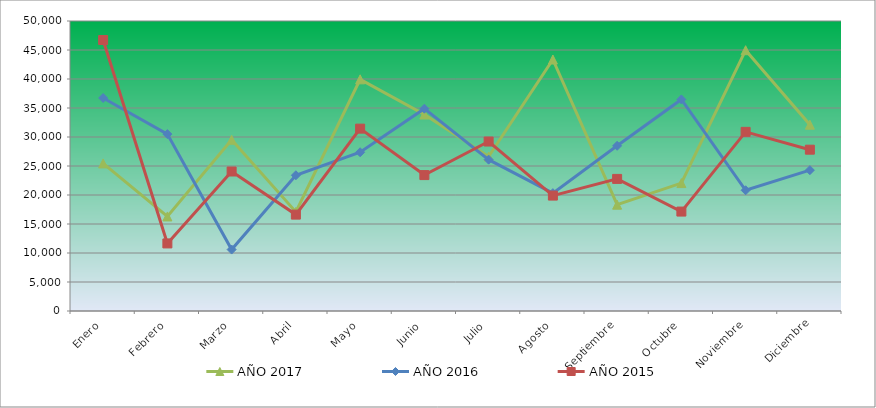
| Category | AÑO 2017 | AÑO 2016 | AÑO 2015 |
|---|---|---|---|
| Enero | 25445.371 | 36726.762 | 46722.034 |
| Febrero | 16301.875 | 30496.487 | 11650.212 |
| Marzo | 29525.121 | 10594.43 | 24049.745 |
| Abril | 17089.389 | 23407.342 | 16617.934 |
| Mayo | 39938.656 | 27367.842 | 31442.267 |
| Junio | 33875.232 | 34880.405 | 23433.637 |
| Julio | 26636.321 | 26097.154 | 29217.799 |
| Agosto | 43361.097 | 20321.682 | 19898.816 |
| Septiembre | 18329.508 | 28483.124 | 22775.111 |
| Octubre | 22056.481 | 36475.19 | 17143.457 |
| Noviembre | 44963.751 | 20813.762 | 30887.616 |
| Diciembre | 32118.107 | 24285.316 | 27813.314 |